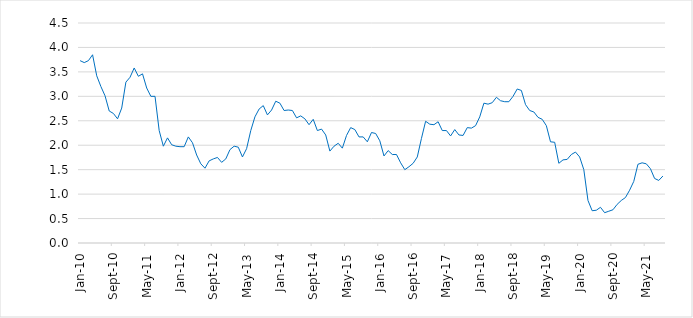
| Category | Series 0 |
|---|---|
| 2010-01-01 | 3.73 |
| 2010-02-01 | 3.69 |
| 2010-03-01 | 3.73 |
| 2010-04-01 | 3.85 |
| 2010-05-01 | 3.42 |
| 2010-06-01 | 3.2 |
| 2010-07-01 | 3.01 |
| 2010-08-01 | 2.7 |
| 2010-09-01 | 2.65 |
| 2010-10-01 | 2.54 |
| 2010-11-01 | 2.76 |
| 2010-12-01 | 3.29 |
| 2011-01-01 | 3.39 |
| 2011-02-01 | 3.58 |
| 2011-03-01 | 3.41 |
| 2011-04-01 | 3.46 |
| 2011-05-01 | 3.17 |
| 2011-06-01 | 3 |
| 2011-07-01 | 3 |
| 2011-08-01 | 2.3 |
| 2011-09-01 | 1.98 |
| 2011-10-01 | 2.15 |
| 2011-11-01 | 2.01 |
| 2011-12-01 | 1.98 |
| 2012-01-01 | 1.97 |
| 2012-02-01 | 1.97 |
| 2012-03-01 | 2.17 |
| 2012-04-01 | 2.05 |
| 2012-05-01 | 1.8 |
| 2012-06-01 | 1.62 |
| 2012-07-01 | 1.53 |
| 2012-08-01 | 1.68 |
| 2012-09-01 | 1.72 |
| 2012-10-01 | 1.75 |
| 2012-11-01 | 1.65 |
| 2012-12-01 | 1.72 |
| 2013-01-01 | 1.91 |
| 2013-02-01 | 1.98 |
| 2013-03-01 | 1.96 |
| 2013-04-01 | 1.76 |
| 2013-05-01 | 1.93 |
| 2013-06-01 | 2.3 |
| 2013-07-01 | 2.58 |
| 2013-08-01 | 2.74 |
| 2013-09-01 | 2.81 |
| 2013-10-01 | 2.62 |
| 2013-11-01 | 2.72 |
| 2013-12-01 | 2.9 |
| 2014-01-01 | 2.86 |
| 2014-02-01 | 2.71 |
| 2014-03-01 | 2.72 |
| 2014-04-01 | 2.71 |
| 2014-05-01 | 2.56 |
| 2014-06-01 | 2.6 |
| 2014-07-01 | 2.54 |
| 2014-08-01 | 2.42 |
| 2014-09-01 | 2.53 |
| 2014-10-01 | 2.3 |
| 2014-11-01 | 2.33 |
| 2014-12-01 | 2.21 |
| 2015-01-01 | 1.88 |
| 2015-02-01 | 1.98 |
| 2015-03-01 | 2.04 |
| 2015-04-01 | 1.94 |
| 2015-05-01 | 2.2 |
| 2015-06-01 | 2.36 |
| 2015-07-01 | 2.32 |
| 2015-08-01 | 2.17 |
| 2015-09-01 | 2.17 |
| 2015-10-01 | 2.07 |
| 2015-11-01 | 2.26 |
| 2015-12-01 | 2.24 |
| 2016-01-01 | 2.09 |
| 2016-02-01 | 1.78 |
| 2016-03-01 | 1.89 |
| 2016-04-01 | 1.81 |
| 2016-05-01 | 1.81 |
| 2016-06-01 | 1.64 |
| 2016-07-01 | 1.5 |
| 2016-08-01 | 1.56 |
| 2016-09-01 | 1.63 |
| 2016-10-01 | 1.76 |
| 2016-11-01 | 2.14 |
| 2016-12-01 | 2.49 |
| 2017-01-01 | 2.43 |
| 2017-02-01 | 2.42 |
| 2017-03-01 | 2.48 |
| 2017-04-01 | 2.3 |
| 2017-05-01 | 2.3 |
| 2017-06-01 | 2.19 |
| 2017-07-01 | 2.32 |
| 2017-08-01 | 2.21 |
| 2017-09-01 | 2.2 |
| 2017-10-01 | 2.36 |
| 2017-11-01 | 2.35 |
| 2017-12-01 | 2.4 |
| 2018-01-01 | 2.58 |
| 2018-02-01 | 2.86 |
| 2018-03-01 | 2.84 |
| 2018-04-01 | 2.87 |
| 2018-05-01 | 2.98 |
| 2018-06-01 | 2.91 |
| 2018-07-01 | 2.89 |
| 2018-08-01 | 2.89 |
| 2018-09-01 | 3 |
| 2018-10-01 | 3.15 |
| 2018-11-01 | 3.12 |
| 2018-12-01 | 2.83 |
| 2019-01-01 | 2.71 |
| 2019-02-01 | 2.68 |
| 2019-03-01 | 2.57 |
| 2019-04-01 | 2.53 |
| 2019-05-01 | 2.4 |
| 2019-06-01 | 2.07 |
| 2019-07-01 | 2.06 |
| 2019-08-01 | 1.63 |
| 2019-09-01 | 1.7 |
| 2019-10-01 | 1.71 |
| 2019-11-01 | 1.81 |
| 2019-12-01 | 1.86 |
| 2020-01-01 | 1.76 |
| 2020-02-01 | 1.5 |
| 2020-03-01 | 0.87 |
| 2020-04-01 | 0.66 |
| 2020-05-01 | 0.67 |
| 2020-06-01 | 0.73 |
| 2020-07-01 | 0.62 |
| 2020-08-01 | 0.65 |
| 2020-09-01 | 0.68 |
| 2020-10-01 | 0.79 |
| 2020-11-01 | 0.87 |
| 2020-12-01 | 0.93 |
| 2021-01-01 | 1.08 |
| 2021-02-01 | 1.26 |
| 2021-03-01 | 1.61 |
| 2021-04-01 | 1.64 |
| 2021-05-01 | 1.62 |
| 2021-06-01 | 1.52 |
| 2021-07-01 | 1.32 |
| 2021-08-01 | 1.28 |
| 2021-09-01 | 1.37 |